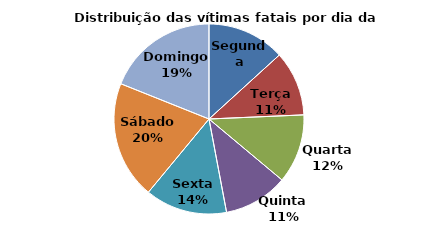
| Category | Series 0 |
|---|---|
| Segunda | 277 |
| Terça | 231 |
| Quarta | 246 |
| Quinta | 229 |
| Sexta | 292 |
| Sábado | 419 |
| Domingo | 396 |